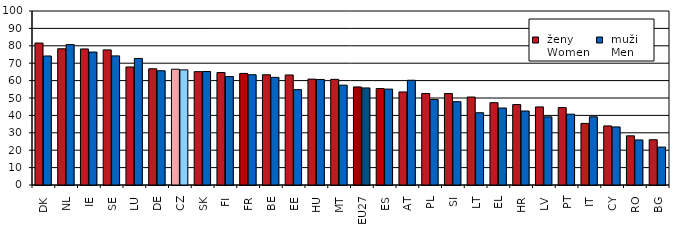
| Category |  ženy 
 Women |  muži 
 Men |
|---|---|---|
| DK | 81.58 | 74.146 |
| NL | 78.282 | 80.685 |
| IE | 78.191 | 76.393 |
| SE | 77.656 | 74.208 |
| LU | 67.83 | 72.739 |
| DE | 66.798 | 65.664 |
| CZ | 66.547 | 66.16 |
| SK | 65.139 | 65.223 |
| FI | 64.64 | 62.303 |
| FR | 64.124 | 63.38 |
| BE | 63.346 | 61.847 |
| EE | 63.232 | 54.806 |
| HU | 60.849 | 60.651 |
| MT | 60.724 | 57.373 |
| EU27 | 56.366 | 55.785 |
| ES | 55.419 | 55.101 |
| AT | 53.481 | 60.204 |
| PL | 52.6 | 49.146 |
| SI | 52.56 | 47.887 |
| LT | 50.558 | 41.533 |
| EL | 47.301 | 44.252 |
| HR | 46.223 | 42.52 |
| LV | 44.865 | 39.182 |
| PT | 44.475 | 40.697 |
| IT | 35.398 | 39.202 |
| CY | 33.953 | 33.371 |
| RO | 28.267 | 25.9 |
| BG | 26.017 | 21.778 |